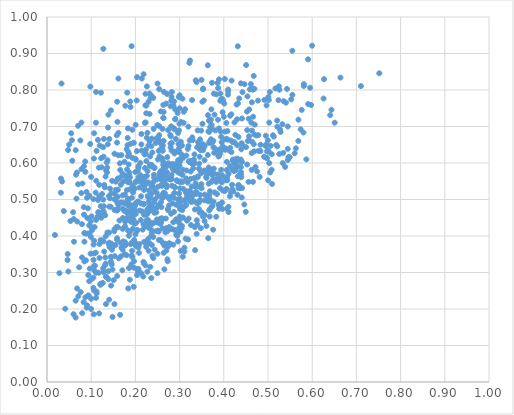
| Category | Series 0 |
|---|---|
| 0.1647939715330098 | 0.599 |
| 0.3296488042928043 | 0.663 |
| 0.3346389834372009 | 0.599 |
| 0.33762191764994354 | 0.515 |
| 0.2297007630078003 | 0.648 |
| 0.15261591563052823 | 0.625 |
| 0.5908335374797933 | 0.762 |
| 0.12536623478145625 | 0.388 |
| 0.2255001425843456 | 0.443 |
| 0.42042667537906664 | 0.606 |
| 0.11815101517886051 | 0.508 |
| 0.17698478531841477 | 0.489 |
| 0.28622173779922444 | 0.757 |
| 0.31093825995851043 | 0.368 |
| 0.25661514680877373 | 0.434 |
| 0.3094355039483727 | 0.74 |
| 0.5473262965644453 | 0.614 |
| 0.367297322441112 | 0.513 |
| 0.2713895836323079 | 0.575 |
| 0.2772224340666608 | 0.501 |
| 0.4302543847449444 | 0.649 |
| 0.38319195607002665 | 0.549 |
| 0.2485749285375688 | 0.445 |
| 0.17636445592563132 | 0.564 |
| 0.2336057651524588 | 0.315 |
| 0.2996886200430412 | 0.479 |
| 0.25508801380796475 | 0.66 |
| 0.40899809305417334 | 0.664 |
| 0.25129944985779873 | 0.535 |
| 0.17501720242080598 | 0.469 |
| 0.3499428072343981 | 0.465 |
| 0.5630660786194708 | 0.64 |
| 0.14795944715609466 | 0.368 |
| 0.03797411287125807 | 0.468 |
| 0.14467624653211975 | 0.744 |
| 0.40116485211009234 | 0.763 |
| 0.2738315659884206 | 0.474 |
| 0.46590479073345403 | 0.801 |
| 0.33956377801183313 | 0.643 |
| 0.05006779467766176 | 0.65 |
| 0.25382084795529924 | 0.676 |
| 0.2990725555899836 | 0.573 |
| 0.41190394632624827 | 0.635 |
| 0.2665732072668914 | 0.587 |
| 0.4742768268728017 | 0.675 |
| 0.0846050820085058 | 0.384 |
| 0.31850911607486776 | 0.638 |
| 0.07789140082200219 | 0.711 |
| 0.18537497727983654 | 0.559 |
| 0.05635231471708235 | 0.662 |
| 0.26652544996912586 | 0.517 |
| 0.534490510406444 | 0.628 |
| 0.2208340853105697 | 0.529 |
| 0.2981745127432366 | 0.604 |
| 0.19648067199287222 | 0.655 |
| 0.30014630612040805 | 0.453 |
| 0.28949408502922835 | 0.534 |
| 0.26065719416709865 | 0.612 |
| 0.3064782510306866 | 0.567 |
| 0.2575075019582751 | 0.578 |
| 0.40949966090398593 | 0.787 |
| 0.5283741248322352 | 0.685 |
| 0.22476542223128215 | 0.605 |
| 0.20374920556510723 | 0.293 |
| 0.5998748639182129 | 0.921 |
| 0.3040232195462842 | 0.55 |
| 0.14040509677185564 | 0.409 |
| 0.2809948103084713 | 0.592 |
| 0.44142245082074527 | 0.531 |
| 0.28187383681681566 | 0.634 |
| 0.48284424624885003 | 0.633 |
| 0.32511026864619885 | 0.577 |
| 0.28080038657756123 | 0.461 |
| 0.349253573783746 | 0.573 |
| 0.2510761549092184 | 0.669 |
| 0.43949723378462846 | 0.561 |
| 0.3108914225750865 | 0.357 |
| 0.08430921451962758 | 0.408 |
| 0.4910825050387383 | 0.617 |
| 0.11145956155170733 | 0.446 |
| 0.2006620672240952 | 0.61 |
| 0.2001423178722912 | 0.489 |
| 0.4191753414010959 | 0.528 |
| 0.2873403180074736 | 0.695 |
| 0.09809063970917131 | 0.809 |
| 0.41728528136156506 | 0.63 |
| 0.37633940543200106 | 0.661 |
| 0.18167989868245626 | 0.464 |
| 0.13749074659250005 | 0.651 |
| 0.09057907609075833 | 0.505 |
| 0.18641728948867753 | 0.481 |
| 0.19212587222503907 | 0.505 |
| 0.21419621945337441 | 0.634 |
| 0.3890711916613917 | 0.695 |
| 0.3890253256146563 | 0.829 |
| 0.22075345490812892 | 0.623 |
| 0.18592896989211471 | 0.566 |
| 0.3658662744370508 | 0.543 |
| 0.34368554078515245 | 0.585 |
| 0.2154283693391369 | 0.467 |
| 0.3285938205875122 | 0.51 |
| 0.4773770994988815 | 0.771 |
| 0.11815845854757323 | 0.464 |
| 0.3116836186258056 | 0.482 |
| 0.06812652151302867 | 0.256 |
| 0.40674776726601125 | 0.581 |
| 0.3972347624051046 | 0.646 |
| 0.2539481152054154 | 0.802 |
| 0.375955244850929 | 0.417 |
| 0.4571286858572807 | 0.673 |
| 0.21478598035384588 | 0.551 |
| 0.14253055604281417 | 0.53 |
| 0.13850229303876338 | 0.303 |
| 0.36855120450970136 | 0.523 |
| 0.09425794906401974 | 0.235 |
| 0.42748614694198195 | 0.587 |
| 0.14229569934855335 | 0.503 |
| 0.14496811035945567 | 0.264 |
| 0.4062189444925989 | 0.666 |
| 0.25755275222533813 | 0.741 |
| 0.1276594729834536 | 0.385 |
| 0.18737355944792433 | 0.28 |
| 0.21086253143700118 | 0.6 |
| 0.3287115400195506 | 0.67 |
| 0.20919622331926857 | 0.378 |
| 0.16659466457018457 | 0.382 |
| 0.36746695713342425 | 0.575 |
| 0.18326552090975357 | 0.695 |
| 0.3462872330939749 | 0.498 |
| 0.21357353155485226 | 0.651 |
| 0.1603434346535838 | 0.527 |
| 0.2996161749616153 | 0.631 |
| 0.37347138082333575 | 0.482 |
| 0.22461952019975628 | 0.736 |
| 0.5951610029169132 | 0.806 |
| 0.2354188223527548 | 0.4 |
| 0.12729586223840894 | 0.5 |
| 0.471642452112225 | 0.589 |
| 0.194127261426827 | 0.419 |
| 0.18995176041122908 | 0.484 |
| 0.298224406915763 | 0.781 |
| 0.2319900135597165 | 0.79 |
| 0.2751013923758229 | 0.419 |
| 0.05308583910887732 | 0.441 |
| 0.3779835917815346 | 0.641 |
| 0.2822735137336819 | 0.655 |
| 0.4635935793490755 | 0.766 |
| 0.351763459391364 | 0.708 |
| 0.060628804464220365 | 0.446 |
| 0.2639372308687683 | 0.519 |
| 0.3556832871718867 | 0.579 |
| 0.22713031381695115 | 0.473 |
| 0.18684243046870397 | 0.466 |
| 0.3872207297792363 | 0.805 |
| 0.25666617675482495 | 0.566 |
| 0.28958253160801994 | 0.631 |
| 0.1638684017903983 | 0.442 |
| 0.21203059791569256 | 0.49 |
| 0.3765000238493391 | 0.643 |
| 0.16138859538170192 | 0.485 |
| 0.054746374601786774 | 0.681 |
| 0.23191125631109466 | 0.434 |
| 0.3150341836402435 | 0.485 |
| 0.21541485835048269 | 0.545 |
| 0.23600839715194932 | 0.285 |
| 0.11088413611356873 | 0.444 |
| 0.14002545817197398 | 0.378 |
| 0.09555676504028565 | 0.276 |
| 0.3077213433920589 | 0.451 |
| 0.2368907134400977 | 0.594 |
| 0.5763136269737836 | 0.745 |
| 0.13812374603403277 | 0.697 |
| 0.11708198575406847 | 0.299 |
| 0.04832415594206252 | 0.303 |
| 0.29364730229215485 | 0.553 |
| 0.4348302035152728 | 0.777 |
| 0.43696240262212016 | 0.569 |
| 0.4316078034686536 | 0.92 |
| 0.2588401053298447 | 0.54 |
| 0.12942940988710783 | 0.357 |
| 0.17668017705753625 | 0.383 |
| 0.3477534670356346 | 0.635 |
| 0.3535053410008212 | 0.804 |
| 0.20902168101564067 | 0.533 |
| 0.17655204370631317 | 0.427 |
| 0.2029014615031599 | 0.771 |
| 0.5449253184525242 | 0.608 |
| 0.5354830249315363 | 0.77 |
| 0.345422614897573 | 0.617 |
| 0.1924565573758702 | 0.359 |
| 0.22061296757219562 | 0.542 |
| 0.3000659118283072 | 0.48 |
| 0.382197975396946 | 0.549 |
| 0.2472508372198312 | 0.465 |
| 0.08973611936823556 | 0.204 |
| 0.2613415738568926 | 0.421 |
| 0.39829568145162464 | 0.771 |
| 0.14113612122213814 | 0.382 |
| 0.34877354876501687 | 0.639 |
| 0.11212122700714666 | 0.633 |
| 0.43447315165958633 | 0.539 |
| 0.2261036641865084 | 0.439 |
| 0.1587540044667468 | 0.29 |
| 0.387870859498719 | 0.618 |
| 0.32953393785021035 | 0.597 |
| 0.2929706530710764 | 0.59 |
| 0.4468325514531809 | 0.816 |
| 0.3945262647806934 | 0.776 |
| 0.420785772248225 | 0.657 |
| 0.2638187566673844 | 0.661 |
| 0.3774243048237689 | 0.79 |
| 0.25527097274122235 | 0.564 |
| 0.30904837346473124 | 0.71 |
| 0.22746149448730857 | 0.578 |
| 0.19221820063633854 | 0.439 |
| 0.29952139181425086 | 0.708 |
| 0.13314385357230218 | 0.288 |
| 0.1273953675940933 | 0.468 |
| 0.3607926117992437 | 0.427 |
| 0.4300179218663891 | 0.72 |
| 0.13081211867833964 | 0.533 |
| 0.07933771651979449 | 0.341 |
| 0.40350693911649527 | 0.665 |
| 0.14099366557188198 | 0.481 |
| 0.31231977372278796 | 0.747 |
| 0.32652272333358123 | 0.506 |
| 0.3783211506762546 | 0.57 |
| 0.180735834162843 | 0.551 |
| 0.18019745831020595 | 0.638 |
| 0.2738450721187934 | 0.371 |
| 0.06488275699159596 | 0.177 |
| 0.20387392045812125 | 0.414 |
| 0.14146727080263255 | 0.37 |
| 0.5003422238031873 | 0.552 |
| 0.2864411433174173 | 0.579 |
| 0.4367792476505129 | 0.531 |
| 0.06566028808915592 | 0.568 |
| 0.1060943666346501 | 0.612 |
| 0.3868659096062068 | 0.718 |
| 0.45281727678650263 | 0.596 |
| 0.37188593597330666 | 0.747 |
| 0.20810304587223571 | 0.354 |
| 0.19326187618402246 | 0.473 |
| 0.25746634597577733 | 0.437 |
| 0.43761960241049613 | 0.605 |
| 0.15352347213316886 | 0.516 |
| 0.21800872545140915 | 0.487 |
| 0.4232769941651271 | 0.578 |
| 0.58104032800931 | 0.811 |
| 0.19175193177237448 | 0.381 |
| 0.296405056466694 | 0.682 |
| 0.3792669518827594 | 0.519 |
| 0.4390596294236092 | 0.568 |
| 0.2907179519780627 | 0.581 |
| 0.20344177734462576 | 0.632 |
| 0.20697418069519924 | 0.592 |
| 0.29860160313383644 | 0.689 |
| 0.30084642830645714 | 0.413 |
| 0.11077418320796817 | 0.71 |
| 0.10658763505802082 | 0.387 |
| 0.16747363521237446 | 0.492 |
| 0.29811156852533494 | 0.444 |
| 0.08367653704714728 | 0.459 |
| 0.29548224478276053 | 0.737 |
| 0.21988092177400098 | 0.561 |
| 0.3910449711406687 | 0.624 |
| 0.39033286827684954 | 0.486 |
| 0.2619394836617225 | 0.515 |
| 0.19335510998716965 | 0.614 |
| 0.3565175126404019 | 0.441 |
| 0.38293541549574295 | 0.453 |
| 0.2016309802505124 | 0.436 |
| 0.2582608704443117 | 0.639 |
| 0.3307873331639657 | 0.585 |
| 0.5738992138250303 | 0.692 |
| 0.45261376754877114 | 0.741 |
| 0.5237222967615204 | 0.772 |
| 0.14450206085034734 | 0.343 |
| 0.2784181549029955 | 0.554 |
| 0.13659565769713522 | 0.41 |
| 0.15258187530581735 | 0.213 |
| 0.10507256999325709 | 0.501 |
| 0.41967852787531057 | 0.581 |
| 0.40802394483468696 | 0.553 |
| 0.26567604174414217 | 0.373 |
| 0.2630679654716378 | 0.724 |
| 0.12614823692552335 | 0.271 |
| 0.19897103944509842 | 0.482 |
| 0.4273425639853434 | 0.58 |
| 0.18777141332871294 | 0.561 |
| 0.2516660846730525 | 0.485 |
| 0.188868202144291 | 0.753 |
| 0.5018446119966193 | 0.773 |
| 0.3790283776144231 | 0.732 |
| 0.2870933180382793 | 0.505 |
| 0.37313942357500474 | 0.693 |
| 0.13515703670450208 | 0.602 |
| 0.46856059984356424 | 0.632 |
| 0.2708862609904741 | 0.534 |
| 0.1071878446467911 | 0.306 |
| 0.18991546663185044 | 0.439 |
| 0.08645060279063177 | 0.604 |
| 0.14730256082309756 | 0.551 |
| 0.08675799114609484 | 0.576 |
| 0.2898497401634119 | 0.72 |
| 0.3046980028808909 | 0.421 |
| 0.2880395469351211 | 0.518 |
| 0.11090850244926054 | 0.795 |
| 0.5210912155808026 | 0.646 |
| 0.16163529005334842 | 0.683 |
| 0.18366833497438528 | 0.547 |
| 0.12699164677895103 | 0.643 |
| 0.19627278884995836 | 0.261 |
| 0.16532766778223218 | 0.184 |
| 0.2963913024135022 | 0.385 |
| 0.21866151555028857 | 0.843 |
| 0.22856097162005518 | 0.444 |
| 0.1972224045552785 | 0.389 |
| 0.38820374686924264 | 0.559 |
| 0.4216016945182941 | 0.523 |
| 0.3872749318704888 | 0.569 |
| 0.3166752571393261 | 0.442 |
| 0.38954114167191956 | 0.475 |
| 0.1882914660743894 | 0.769 |
| 0.23120081111944646 | 0.525 |
| 0.16143175192625747 | 0.621 |
| 0.30880419352948596 | 0.479 |
| 0.4309311417858266 | 0.612 |
| 0.12455771508005709 | 0.515 |
| 0.1205204012066865 | 0.453 |
| 0.13409742405989178 | 0.288 |
| 0.028107240281665002 | 0.298 |
| 0.2961866596243232 | 0.5 |
| 0.2843674087744281 | 0.418 |
| 0.18147551100399084 | 0.793 |
| 0.32058540790174606 | 0.605 |
| 0.23411450789792632 | 0.505 |
| 0.5906567446229637 | 0.884 |
| 0.24782632222368906 | 0.555 |
| 0.19369060927819715 | 0.454 |
| 0.2722424724421352 | 0.616 |
| 0.42890816676925725 | 0.76 |
| 0.21647471177873823 | 0.417 |
| 0.4234377264464194 | 0.607 |
| 0.3231393753442291 | 0.496 |
| 0.031371623927149095 | 0.519 |
| 0.27887664628371867 | 0.677 |
| 0.15242835232463248 | 0.5 |
| 0.16024132553520287 | 0.472 |
| 0.5041453948584654 | 0.795 |
| 0.15855027727695958 | 0.39 |
| 0.4139972379782424 | 0.591 |
| 0.17046858633438744 | 0.306 |
| 0.3952479426353377 | 0.547 |
| 0.17163187536608326 | 0.449 |
| 0.36516707276118454 | 0.686 |
| 0.09860427875357602 | 0.352 |
| 0.2808930256775579 | 0.7 |
| 0.552445748835957 | 0.774 |
| 0.23957662759281817 | 0.47 |
| 0.3447059654868093 | 0.493 |
| 0.23336309041315162 | 0.618 |
| 0.31699700579843426 | 0.509 |
| 0.33837512258237956 | 0.521 |
| 0.33904828539429654 | 0.443 |
| 0.4560072169308391 | 0.548 |
| 0.24086482334978354 | 0.477 |
| 0.3951139754813069 | 0.657 |
| 0.5603654522387099 | 0.627 |
| 0.2513454065898899 | 0.415 |
| 0.2195017560258138 | 0.324 |
| 0.4107036376516858 | 0.57 |
| 0.07919833234204954 | 0.433 |
| 0.26313125053751707 | 0.759 |
| 0.34078570848893097 | 0.689 |
| 0.19936715679563277 | 0.471 |
| 0.21762919772788136 | 0.289 |
| 0.3346927307715245 | 0.473 |
| 0.22330226503499817 | 0.711 |
| 0.38601296390546924 | 0.819 |
| 0.2671677980541054 | 0.418 |
| 0.09610256123921534 | 0.405 |
| 0.17117692102262017 | 0.42 |
| 0.3773856847078504 | 0.585 |
| 0.2068660640069816 | 0.587 |
| 0.5867636477734147 | 0.61 |
| 0.20151113419221944 | 0.55 |
| 0.5491047804863667 | 0.616 |
| 0.24243846680832637 | 0.493 |
| 0.09584868953165637 | 0.51 |
| 0.46788146971948164 | 0.651 |
| 0.36797212659851064 | 0.453 |
| 0.23661900717484297 | 0.535 |
| 0.0845304450961365 | 0.33 |
| 0.4283230491467602 | 0.605 |
| 0.21848310341569566 | 0.56 |
| 0.2701966178031068 | 0.36 |
| 0.23608160003416534 | 0.646 |
| 0.364231549810355 | 0.731 |
| 0.18289324723321765 | 0.485 |
| 0.4810988252088474 | 0.562 |
| 0.39619857013372994 | 0.492 |
| 0.09873966650565891 | 0.44 |
| 0.200145888108329 | 0.611 |
| 0.06484653317821587 | 0.223 |
| 0.2007280641397916 | 0.46 |
| 0.3783735266955951 | 0.628 |
| 0.5028556449843677 | 0.711 |
| 0.2612487131938175 | 0.574 |
| 0.38664168743398886 | 0.625 |
| 0.5112424362113462 | 0.676 |
| 0.23326661295027307 | 0.477 |
| 0.12878882973791306 | 0.666 |
| 0.24851042437558757 | 0.437 |
| 0.38947563777544303 | 0.552 |
| 0.1914646285838778 | 0.447 |
| 0.26418470500504343 | 0.551 |
| 0.16559949123449647 | 0.581 |
| 0.33239191014496106 | 0.495 |
| 0.22788818703174607 | 0.51 |
| 0.4097680889912587 | 0.801 |
| 0.298784340714921 | 0.641 |
| 0.35239434901537736 | 0.652 |
| 0.3364129223218144 | 0.534 |
| 0.33649824223492486 | 0.827 |
| 0.16841978085365583 | 0.368 |
| 0.46311401323027523 | 0.581 |
| 0.3569143768237838 | 0.513 |
| 0.12210078643533351 | 0.793 |
| 0.23179522210153414 | 0.482 |
| 0.1955162726841153 | 0.444 |
| 0.4034353007921133 | 0.64 |
| 0.15784900398433954 | 0.676 |
| 0.30276907878570314 | 0.658 |
| 0.26748854203841343 | 0.553 |
| 0.05729101526625524 | 0.606 |
| 0.5550075964932493 | 0.907 |
| 0.06490964638963592 | 0.635 |
| 0.4780767472604479 | 0.676 |
| 0.2354402548103799 | 0.591 |
| 0.25493606419585946 | 0.482 |
| 0.09971136402197955 | 0.2 |
| 0.1482501740074288 | 0.178 |
| 0.23579756177133337 | 0.431 |
| 0.34544205208558343 | 0.464 |
| 0.3668579692213012 | 0.47 |
| 0.5325094253735185 | 0.706 |
| 0.49974417919914926 | 0.662 |
| 0.32586002518244983 | 0.43 |
| 0.3013700176890459 | 0.547 |
| 0.4204832697366433 | 0.609 |
| 0.6406821902202587 | 0.731 |
| 0.4176272339730057 | 0.826 |
| 0.10587890236037167 | 0.185 |
| 0.11783368638697767 | 0.188 |
| 0.1604238845909136 | 0.557 |
| 0.5975419826118344 | 0.759 |
| 0.5685767910237229 | 0.66 |
| 0.07274810485007044 | 0.314 |
| 0.24044292683826718 | 0.397 |
| 0.2057396707156267 | 0.303 |
| 0.3724094886490623 | 0.705 |
| 0.11530931485588503 | 0.455 |
| 0.26391145764953994 | 0.74 |
| 0.44111591338857903 | 0.722 |
| 0.21142710205346316 | 0.567 |
| 0.3889877946816822 | 0.619 |
| 0.39668311991818206 | 0.474 |
| 0.3324022462487728 | 0.609 |
| 0.09325651944488356 | 0.293 |
| 0.3184559965028929 | 0.506 |
| 0.2291687605417474 | 0.547 |
| 0.5008434358910254 | 0.781 |
| 0.1400712346753844 | 0.509 |
| 0.25449152506829065 | 0.618 |
| 0.2319155314449537 | 0.66 |
| 0.22566715115999458 | 0.669 |
| 0.43885884987273327 | 0.818 |
| 0.3940363251144703 | 0.581 |
| 0.36024374724946284 | 0.562 |
| 0.11145966501048876 | 0.551 |
| 0.36463068685037225 | 0.505 |
| 0.20182760043902437 | 0.49 |
| 0.3026064226872245 | 0.481 |
| 0.643609763346324 | 0.746 |
| 0.2668540206870107 | 0.572 |
| 0.360874153834538 | 0.559 |
| 0.09561100855778859 | 0.429 |
| 0.28405035028338466 | 0.489 |
| 0.1280174498363772 | 0.617 |
| 0.2425298792840408 | 0.586 |
| 0.1722319628625958 | 0.549 |
| 0.11088827731997675 | 0.23 |
| 0.3552108441858982 | 0.643 |
| 0.23171069810911138 | 0.508 |
| 0.34639138467316144 | 0.513 |
| 0.12287525046762171 | 0.45 |
| 0.2750640381614846 | 0.561 |
| 0.046488510117494886 | 0.334 |
| 0.3669111682286832 | 0.685 |
| 0.2919891776059884 | 0.486 |
| 0.4660426579195731 | 0.548 |
| 0.42411818060242124 | 0.657 |
| 0.3051806606866402 | 0.428 |
| 0.2723736091687511 | 0.336 |
| 0.21981949499871323 | 0.384 |
| 0.3649706649762513 | 0.575 |
| 0.12875406309552317 | 0.481 |
| 0.38771608741725994 | 0.486 |
| 0.08350045152788799 | 0.591 |
| 0.5058646368266709 | 0.647 |
| 0.2072138243632261 | 0.31 |
| 0.08928730240412563 | 0.521 |
| 0.28899164485118667 | 0.534 |
| 0.22634369102974716 | 0.46 |
| 0.43853945420302975 | 0.61 |
| 0.29528019908170855 | 0.551 |
| 0.4979404217771686 | 0.613 |
| 0.14619365017766417 | 0.379 |
| 0.23831763728832778 | 0.415 |
| 0.12118531813575462 | 0.389 |
| 0.13585559842650252 | 0.574 |
| 0.17715062628305445 | 0.757 |
| 0.1822023593720853 | 0.649 |
| 0.36222496673105764 | 0.51 |
| 0.2873479585231097 | 0.466 |
| 0.3677913634405269 | 0.715 |
| 0.22700371278233067 | 0.302 |
| 0.10551803346845723 | 0.377 |
| 0.4389594247631393 | 0.575 |
| 0.15562055045226086 | 0.549 |
| 0.2384216653685447 | 0.346 |
| 0.2881314494010434 | 0.692 |
| 0.40010812570405063 | 0.727 |
| 0.2219587382310234 | 0.383 |
| 0.23832003061711782 | 0.629 |
| 0.07803924491553205 | 0.583 |
| 0.49922059102592675 | 0.635 |
| 0.07016042481088292 | 0.702 |
| 0.15304580461917494 | 0.345 |
| 0.3294367233481791 | 0.597 |
| 0.18581514434723834 | 0.574 |
| 0.08321944979097506 | 0.479 |
| 0.2233891294120559 | 0.626 |
| 0.3205066251263261 | 0.448 |
| 0.24050470917307343 | 0.779 |
| 0.17996764224720707 | 0.347 |
| 0.3570504685576411 | 0.648 |
| 0.144523857889448 | 0.33 |
| 0.041261056608529856 | 0.201 |
| 0.3679315527185718 | 0.655 |
| 0.296485027358117 | 0.607 |
| 0.13717188076558873 | 0.607 |
| 0.23306897350721445 | 0.595 |
| 0.3708169272852141 | 0.719 |
| 0.24126993085654747 | 0.694 |
| 0.3638048722539493 | 0.622 |
| 0.17128310357145937 | 0.362 |
| 0.2816445149015575 | 0.567 |
| 0.30163369600224177 | 0.412 |
| 0.20698232157835117 | 0.368 |
| 0.3004123001888682 | 0.653 |
| 0.09370025072362809 | 0.407 |
| 0.15750141112741523 | 0.425 |
| 0.19647153900072856 | 0.313 |
| 0.28280018649993033 | 0.538 |
| 0.2880109260176261 | 0.585 |
| 0.16702478891117634 | 0.54 |
| 0.18380150113592886 | 0.256 |
| 0.34327361559612213 | 0.475 |
| 0.24179784570147922 | 0.47 |
| 0.19452887884731063 | 0.52 |
| 0.177038932120956 | 0.375 |
| 0.29038915558344003 | 0.721 |
| 0.2621565342230542 | 0.648 |
| 0.21822189289479654 | 0.329 |
| 0.5167364503196195 | 0.804 |
| 0.15875519821599726 | 0.492 |
| 0.16047126635736408 | 0.424 |
| 0.11025521503642166 | 0.354 |
| 0.3808877576892922 | 0.689 |
| 0.23223272144528107 | 0.734 |
| 0.24784761827383794 | 0.476 |
| 0.185232759736482 | 0.624 |
| 0.09980298202749549 | 0.228 |
| 0.21822471312298009 | 0.432 |
| 0.2823750426701135 | 0.556 |
| 0.33994863088760585 | 0.432 |
| 0.223232291371664 | 0.431 |
| 0.09919603150981116 | 0.398 |
| 0.0869653304040745 | 0.232 |
| 0.2693519935784281 | 0.589 |
| 0.34801622424860346 | 0.422 |
| 0.2194593784585266 | 0.526 |
| 0.20368832994703812 | 0.31 |
| 0.11868757868861013 | 0.378 |
| 0.6639072299410159 | 0.834 |
| 0.1480798386275597 | 0.308 |
| 0.30004494443006 | 0.75 |
| 0.3638128477422815 | 0.868 |
| 0.2848091166166069 | 0.598 |
| 0.22993991303634642 | 0.359 |
| 0.37680859968743896 | 0.494 |
| 0.41377213182608163 | 0.509 |
| 0.0316076073923095 | 0.557 |
| 0.2797470533510582 | 0.643 |
| 0.22230967366755017 | 0.426 |
| 0.4217179741003194 | 0.583 |
| 0.5017016979580184 | 0.631 |
| 0.5091986739820407 | 0.543 |
| 0.176318943794463 | 0.513 |
| 0.37100141947419896 | 0.665 |
| 0.19686086058801344 | 0.331 |
| 0.10505485561162797 | 0.258 |
| 0.3136547005409849 | 0.393 |
| 0.1833465680947317 | 0.493 |
| 0.23256122896637377 | 0.437 |
| 0.27966348894194193 | 0.755 |
| 0.40330481632449544 | 0.56 |
| 0.5810925250940719 | 0.816 |
| 0.3289220863852098 | 0.604 |
| 0.2290203496050075 | 0.392 |
| 0.751754294185146 | 0.846 |
| 0.2555415310397261 | 0.447 |
| 0.08022879403794325 | 0.544 |
| 0.34936999435192173 | 0.542 |
| 0.05912144220118054 | 0.465 |
| 0.0967690685982795 | 0.311 |
| 0.265850769600098 | 0.569 |
| 0.19081167718960446 | 0.322 |
| 0.4295704976585185 | 0.593 |
| 0.14562001764070287 | 0.517 |
| 0.46909085945633167 | 0.678 |
| 0.3972879590684104 | 0.775 |
| 0.2573657033671617 | 0.654 |
| 0.24790765993116026 | 0.667 |
| 0.14111145235667577 | 0.666 |
| 0.3664659989783481 | 0.717 |
| 0.15804765029229773 | 0.47 |
| 0.1076916737189838 | 0.424 |
| 0.314796123033409 | 0.558 |
| 0.30142843832038124 | 0.492 |
| 0.219482265980106 | 0.554 |
| 0.08859875760898761 | 0.407 |
| 0.3488886688772259 | 0.689 |
| 0.5027773690471709 | 0.6 |
| 0.17570691641037328 | 0.35 |
| 0.155011813995375 | 0.375 |
| 0.25152496713321637 | 0.661 |
| 0.22952624681806122 | 0.465 |
| 0.4496502323289575 | 0.466 |
| 0.1823828719292544 | 0.45 |
| 0.2434364864245585 | 0.587 |
| 0.5447160965677573 | 0.7 |
| 0.2702393524209522 | 0.54 |
| 0.4405617355308937 | 0.506 |
| 0.17844051916347425 | 0.443 |
| 0.42617441131606193 | 0.677 |
| 0.45353518282293703 | 0.782 |
| 0.10487579799680857 | 0.286 |
| 0.3146997718270972 | 0.518 |
| 0.49412678982043423 | 0.647 |
| 0.4959776441867969 | 0.651 |
| 0.1308706844740335 | 0.32 |
| 0.21503648265094244 | 0.556 |
| 0.3973230467009067 | 0.525 |
| 0.3365806504282334 | 0.537 |
| 0.40703984580568575 | 0.603 |
| 0.4693655245707693 | 0.803 |
| 0.3110560294898549 | 0.496 |
| 0.15213408703232312 | 0.413 |
| 0.30333171368788125 | 0.712 |
| 0.2730746591250548 | 0.331 |
| 0.2960317264156379 | 0.631 |
| 0.22885391183375148 | 0.441 |
| 0.26761779888622117 | 0.379 |
| 0.2531742235012645 | 0.389 |
| 0.38459638209613534 | 0.515 |
| 0.14076510090118988 | 0.225 |
| 0.2550357922788371 | 0.572 |
| 0.1899932054200325 | 0.464 |
| 0.3405642096305851 | 0.56 |
| 0.23301284728752392 | 0.593 |
| 0.11922943968790656 | 0.648 |
| 0.17821774694083858 | 0.376 |
| 0.31561868395464787 | 0.58 |
| 0.4227586442026684 | 0.599 |
| 0.4426373551579156 | 0.648 |
| 0.3498376652400045 | 0.531 |
| 0.2501416328845516 | 0.818 |
| 0.5447063481385583 | 0.639 |
| 0.3740491228931835 | 0.483 |
| 0.21795558634255108 | 0.539 |
| 0.15272060167072388 | 0.471 |
| 0.12702839983995073 | 0.311 |
| 0.5049274558441662 | 0.574 |
| 0.6268285731901801 | 0.83 |
| 0.49791204753401563 | 0.631 |
| 0.24746181030265268 | 0.413 |
| 0.31641455890173287 | 0.519 |
| 0.22425925474879593 | 0.37 |
| 0.25447314387112163 | 0.435 |
| 0.12826113126677863 | 0.465 |
| 0.28760594527724015 | 0.769 |
| 0.1875808547880935 | 0.528 |
| 0.43218800403495616 | 0.764 |
| 0.2761019262488813 | 0.484 |
| 0.28257506707946833 | 0.794 |
| 0.34454220425543836 | 0.598 |
| 0.120716459561507 | 0.267 |
| 0.13345800503286243 | 0.214 |
| 0.12253039625316875 | 0.613 |
| 0.3013768005095915 | 0.605 |
| 0.5086965122145729 | 0.624 |
| 0.1926488986140601 | 0.342 |
| 0.34607845137235504 | 0.535 |
| 0.23399589641765062 | 0.777 |
| 0.12134801427802944 | 0.269 |
| 0.2041021687383585 | 0.417 |
| 0.2812000907925387 | 0.77 |
| 0.49183834107651725 | 0.773 |
| 0.22460966084730005 | 0.385 |
| 0.2399320419204245 | 0.547 |
| 0.5211495941940429 | 0.699 |
| 0.3464332903737184 | 0.665 |
| 0.1842241620753382 | 0.63 |
| 0.3762224779936806 | 0.555 |
| 0.3421087024865974 | 0.657 |
| 0.27379644274012993 | 0.471 |
| 0.26291082856440684 | 0.507 |
| 0.16153816485746353 | 0.831 |
| 0.41046705472841505 | 0.48 |
| 0.22390997900353837 | 0.637 |
| 0.23904276945293967 | 0.536 |
| 0.2628818286735004 | 0.595 |
| 0.032845565183884706 | 0.818 |
| 0.20119405755092146 | 0.373 |
| 0.2857993528858863 | 0.376 |
| 0.542927583579805 | 0.803 |
| 0.18740933888181643 | 0.443 |
| 0.2571475367668544 | 0.555 |
| 0.4626707045390662 | 0.806 |
| 0.2353152576963694 | 0.484 |
| 0.3741456250802032 | 0.657 |
| 0.3162019805111844 | 0.523 |
| 0.40769358055771576 | 0.475 |
| 0.15103680761039828 | 0.279 |
| 0.39125106216615446 | 0.483 |
| 0.07555694035829097 | 0.662 |
| 0.15258260542680613 | 0.418 |
| 0.47793036327751026 | 0.633 |
| 0.0703737221579166 | 0.542 |
| 0.15566772812893848 | 0.527 |
| 0.2889271042171969 | 0.417 |
| 0.30599896194139864 | 0.471 |
| 0.20114250903511444 | 0.548 |
| 0.11236929443203358 | 0.243 |
| 0.18901554821597 | 0.653 |
| 0.2575925518536144 | 0.557 |
| 0.26573192432167736 | 0.567 |
| 0.2610012830160894 | 0.446 |
| 0.45027011753862833 | 0.643 |
| 0.2607290040211162 | 0.504 |
| 0.3022183088573873 | 0.359 |
| 0.16912931410189203 | 0.564 |
| 0.21050686511077688 | 0.552 |
| 0.38408592396394914 | 0.636 |
| 0.13891383111727318 | 0.732 |
| 0.06854506754688261 | 0.44 |
| 0.527218222736372 | 0.692 |
| 0.17269728042489518 | 0.385 |
| 0.4023128644058107 | 0.83 |
| 0.46379343146835716 | 0.689 |
| 0.24309619447499964 | 0.464 |
| 0.26812480562714724 | 0.41 |
| 0.22844805985306127 | 0.435 |
| 0.2636590367901561 | 0.586 |
| 0.2363967911140522 | 0.516 |
| 0.2580824947094381 | 0.493 |
| 0.18557450378954887 | 0.312 |
| 0.35695110970991095 | 0.498 |
| 0.44224356765901685 | 0.794 |
| 0.5335269425643202 | 0.6 |
| 0.3227690480284875 | 0.662 |
| 0.4829672613346422 | 0.65 |
| 0.4410606097416029 | 0.603 |
| 0.47008624030505164 | 0.705 |
| 0.18115349168559436 | 0.582 |
| 0.2259061403176067 | 0.81 |
| 0.43257295317979194 | 0.539 |
| 0.17102255612526962 | 0.371 |
| 0.3073551902977537 | 0.582 |
| 0.5801515810218293 | 0.683 |
| 0.41872899376511485 | 0.54 |
| 0.14702743066838997 | 0.362 |
| 0.1975016514468414 | 0.528 |
| 0.11009976105858121 | 0.519 |
| 0.2438881733284508 | 0.525 |
| 0.2100799026508362 | 0.47 |
| 0.17139288343804693 | 0.475 |
| 0.40576535146172654 | 0.71 |
| 0.27401876811893766 | 0.69 |
| 0.19150611080107272 | 0.473 |
| 0.47541722533383934 | 0.577 |
| 0.12776833172266555 | 0.457 |
| 0.01794504644865824 | 0.403 |
| 0.3525897749734671 | 0.454 |
| 0.34720920047264503 | 0.642 |
| 0.1831724781228753 | 0.618 |
| 0.29440846931290443 | 0.401 |
| 0.24993990574574587 | 0.351 |
| 0.3317094828123437 | 0.517 |
| 0.4331330397784866 | 0.672 |
| 0.4613497647476569 | 0.816 |
| 0.12112623389851873 | 0.267 |
| 0.2132857602320809 | 0.298 |
| 0.5387877253529123 | 0.589 |
| 0.115321230413992 | 0.499 |
| 0.305436284937991 | 0.648 |
| 0.3382447945648225 | 0.822 |
| 0.3182590251483878 | 0.546 |
| 0.28402739392105836 | 0.586 |
| 0.21973231305113594 | 0.458 |
| 0.09074786520682587 | 0.21 |
| 0.3614314112083724 | 0.57 |
| 0.1597950797454294 | 0.507 |
| 0.2975438974541681 | 0.652 |
| 0.23224906864910455 | 0.38 |
| 0.13210745673153312 | 0.341 |
| 0.26558052740689686 | 0.309 |
| 0.3928322511610669 | 0.686 |
| 0.46317877499278703 | 0.627 |
| 0.1914798809815833 | 0.347 |
| 0.25276833251760145 | 0.633 |
| 0.3202416809585851 | 0.647 |
| 0.3198773386632153 | 0.511 |
| 0.4043464945292874 | 0.553 |
| 0.15950379172255014 | 0.473 |
| 0.1866929280723253 | 0.549 |
| 0.41076608522393065 | 0.466 |
| 0.2857316508366451 | 0.438 |
| 0.2944011839827746 | 0.551 |
| 0.22286088915845093 | 0.789 |
| 0.23699533919836935 | 0.667 |
| 0.26192931608839 | 0.381 |
| 0.18257515459078655 | 0.461 |
| 0.39068067888850955 | 0.637 |
| 0.29501765219306286 | 0.599 |
| 0.2371846773287305 | 0.376 |
| 0.2963294296063965 | 0.588 |
| 0.3690658031047016 | 0.698 |
| 0.09943082253424451 | 0.426 |
| 0.336295746997486 | 0.544 |
| 0.10664100362351137 | 0.318 |
| 0.20590820000640453 | 0.551 |
| 0.40309518675692213 | 0.636 |
| 0.1152146347212698 | 0.663 |
| 0.09248935830527127 | 0.476 |
| 0.25376614868948677 | 0.701 |
| 0.26097655757533944 | 0.641 |
| 0.41703564652340963 | 0.733 |
| 0.12431676375136558 | 0.48 |
| 0.3000401884018903 | 0.61 |
| 0.14393375538859876 | 0.48 |
| 0.4309104399332041 | 0.513 |
| 0.42742065676359187 | 0.611 |
| 0.36487979464243014 | 0.495 |
| 0.2802320195818072 | 0.673 |
| 0.5462766060189465 | 0.616 |
| 0.21443101321828606 | 0.832 |
| 0.46231202391066173 | 0.71 |
| 0.08815315788244349 | 0.333 |
| 0.19724601835238353 | 0.378 |
| 0.12746784804435263 | 0.913 |
| 0.40720698926497123 | 0.561 |
| 0.10652780238946269 | 0.352 |
| 0.16260920804181678 | 0.339 |
| 0.3714699213346765 | 0.662 |
| 0.4950637587412974 | 0.675 |
| 0.34345717643222484 | 0.653 |
| 0.26959678935776676 | 0.763 |
| 0.39366537501183496 | 0.634 |
| 0.04682777632318602 | 0.351 |
| 0.225555553375423 | 0.467 |
| 0.2404412402389059 | 0.34 |
| 0.2571970406044626 | 0.388 |
| 0.37344234656275344 | 0.82 |
| 0.2795586908675326 | 0.378 |
| 0.15858212295773488 | 0.394 |
| 0.25105719870774457 | 0.509 |
| 0.5083292696927699 | 0.581 |
| 0.2985789503056874 | 0.436 |
| 0.30101409206092533 | 0.474 |
| 0.12791988412315114 | 0.301 |
| 0.2575649641931278 | 0.438 |
| 0.15871501850780034 | 0.768 |
| 0.38977865027546943 | 0.484 |
| 0.32665326493711766 | 0.493 |
| 0.06664013280653547 | 0.502 |
| 0.45792933316722617 | 0.662 |
| 0.3919515343138237 | 0.77 |
| 0.13176333835273413 | 0.457 |
| 0.3385732942278151 | 0.406 |
| 0.172938830876729 | 0.491 |
| 0.17118400913752585 | 0.511 |
| 0.06766596336323183 | 0.574 |
| 0.2817062276239539 | 0.781 |
| 0.1390691704033229 | 0.282 |
| 0.2440188735721719 | 0.5 |
| 0.07082280673708263 | 0.235 |
| 0.2744431210689664 | 0.599 |
| 0.41619475006660844 | 0.662 |
| 0.4333056279213491 | 0.532 |
| 0.29980510347417133 | 0.593 |
| 0.3515141201817449 | 0.768 |
| 0.12353870067811534 | 0.588 |
| 0.224216441236753 | 0.543 |
| 0.3232238249818613 | 0.523 |
| 0.22136568482822871 | 0.71 |
| 0.5552465635500049 | 0.787 |
| 0.23624909140431127 | 0.541 |
| 0.11724229310206113 | 0.587 |
| 0.19309701433935822 | 0.691 |
| 0.5245476077013758 | 0.81 |
| 0.19997913530506373 | 0.404 |
| 0.22169911898644978 | 0.586 |
| 0.2227355494094786 | 0.758 |
| 0.3685570094564936 | 0.501 |
| 0.2636333722449906 | 0.723 |
| 0.06108403846084398 | 0.384 |
| 0.1829664443843928 | 0.415 |
| 0.24226390307796974 | 0.56 |
| 0.6508822310744169 | 0.71 |
| 0.24987236657558098 | 0.298 |
| 0.44637988827359487 | 0.486 |
| 0.496788837039182 | 0.758 |
| 0.3080488272710643 | 0.529 |
| 0.414292970181364 | 0.642 |
| 0.4319412127330564 | 0.564 |
| 0.408184824290483 | 0.687 |
| 0.17133692470402706 | 0.571 |
| 0.2037368749261843 | 0.835 |
| 0.3529885050327324 | 0.635 |
| 0.33363805996559026 | 0.624 |
| 0.2053711423795811 | 0.579 |
| 0.047726052414296616 | 0.636 |
| 0.09984875296827389 | 0.562 |
| 0.18779684356037496 | 0.412 |
| 0.18540703182949625 | 0.401 |
| 0.22946911529851755 | 0.424 |
| 0.22600930356614335 | 0.565 |
| 0.35285269587216206 | 0.802 |
| 0.2067746612729734 | 0.561 |
| 0.30123362205992976 | 0.53 |
| 0.12949493211583019 | 0.54 |
| 0.2496469980373286 | 0.704 |
| 0.22974424560696916 | 0.768 |
| 0.28824040191339584 | 0.626 |
| 0.2589160427406979 | 0.479 |
| 0.34017502566537183 | 0.489 |
| 0.6257302561664211 | 0.777 |
| 0.2613245749783042 | 0.612 |
| 0.3695274777521854 | 0.496 |
| 0.14630391773882967 | 0.322 |
| 0.36894945393796497 | 0.583 |
| 0.1769490327786628 | 0.439 |
| 0.40271435559372604 | 0.686 |
| 0.2300948819286438 | 0.494 |
| 0.392270515019696 | 0.79 |
| 0.13298760229770468 | 0.324 |
| 0.15850108650241568 | 0.656 |
| 0.2628609535113975 | 0.604 |
| 0.13930247355186598 | 0.38 |
| 0.3569795483404967 | 0.457 |
| 0.5206463698507672 | 0.716 |
| 0.3226512734321101 | 0.602 |
| 0.22911557685666784 | 0.507 |
| 0.3136555294995854 | 0.501 |
| 0.07629993552018355 | 0.246 |
| 0.3814444807336962 | 0.555 |
| 0.10178564128878143 | 0.416 |
| 0.11882865998641923 | 0.34 |
| 0.2714897362908696 | 0.789 |
| 0.11572095190505294 | 0.465 |
| 0.2658213648209756 | 0.592 |
| 0.40635770148406536 | 0.529 |
| 0.18921442386067822 | 0.378 |
| 0.2611693032021477 | 0.694 |
| 0.13371248846336725 | 0.579 |
| 0.36568358177924654 | 0.588 |
| 0.33277628703602524 | 0.559 |
| 0.2228157076440419 | 0.32 |
| 0.2735076131988097 | 0.507 |
| 0.12163057393150334 | 0.482 |
| 0.18474810502249794 | 0.596 |
| 0.21366178948719283 | 0.679 |
| 0.19742973189760826 | 0.434 |
| 0.3836291937974565 | 0.788 |
| 0.30054731068299045 | 0.503 |
| 0.39406555546420274 | 0.672 |
| 0.3082045995871575 | 0.614 |
| 0.30726792235652245 | 0.343 |
| 0.3049975951751759 | 0.623 |
| 0.264552096510682 | 0.795 |
| 0.09343648964338047 | 0.238 |
| 0.3548540196903103 | 0.771 |
| 0.525489279736928 | 0.625 |
| 0.10077274597705954 | 0.454 |
| 0.197434719405728 | 0.531 |
| 0.1764891538541432 | 0.47 |
| 0.40984541395504615 | 0.796 |
| 0.5186722238471313 | 0.649 |
| 0.45291636020619197 | 0.69 |
| 0.23712539866365312 | 0.409 |
| 0.466390861396354 | 0.727 |
| 0.2921183171733147 | 0.446 |
| 0.2416234007630591 | 0.436 |
| 0.23549585041936405 | 0.785 |
| 0.49618255689485824 | 0.614 |
| 0.3447335801335294 | 0.639 |
| 0.13252253873985342 | 0.563 |
| 0.2833851820083504 | 0.51 |
| 0.41431060587793833 | 0.73 |
| 0.3253624968276615 | 0.606 |
| 0.2599722601465302 | 0.537 |
| 0.3235672730816106 | 0.881 |
| 0.03406514491974599 | 0.549 |
| 0.3274942939575505 | 0.535 |
| 0.5131333600355878 | 0.672 |
| 0.467687195115843 | 0.839 |
| 0.5688104037884295 | 0.719 |
| 0.09130540412524202 | 0.449 |
| 0.3693506802986365 | 0.475 |
| 0.11217135774687659 | 0.248 |
| 0.18459577111345715 | 0.502 |
| 0.21231069252251666 | 0.444 |
| 0.27633653809395553 | 0.38 |
| 0.4403417339938456 | 0.654 |
| 0.2157854384383331 | 0.559 |
| 0.24592564399856376 | 0.655 |
| 0.28020635698369556 | 0.595 |
| 0.20623781481170123 | 0.495 |
| 0.2527072545909319 | 0.412 |
| 0.26886915643700415 | 0.448 |
| 0.24364066465846712 | 0.363 |
| 0.3417812012737832 | 0.563 |
| 0.3152892013373616 | 0.62 |
| 0.3350656737619768 | 0.361 |
| 0.19487889706770045 | 0.481 |
| 0.24811825882087468 | 0.519 |
| 0.11811136768358355 | 0.54 |
| 0.10656715694151442 | 0.682 |
| 0.36478413690444333 | 0.394 |
| 0.4590127247669028 | 0.802 |
| 0.23596843074120866 | 0.486 |
| 0.32214008195099886 | 0.874 |
| 0.08290992825420351 | 0.219 |
| 0.31977964283782667 | 0.7 |
| 0.41621204176539905 | 0.519 |
| 0.1751869158790279 | 0.603 |
| 0.3564468708184295 | 0.608 |
| 0.1594298182461552 | 0.713 |
| 0.19963662890378808 | 0.382 |
| 0.2736521337260859 | 0.414 |
| 0.2598113659368879 | 0.449 |
| 0.43857163636696217 | 0.589 |
| 0.2640901146921498 | 0.354 |
| 0.11067893012257102 | 0.299 |
| 0.19137222110909446 | 0.92 |
| 0.2990692210169591 | 0.422 |
| 0.35765651834239875 | 0.579 |
| 0.3697320437745534 | 0.578 |
| 0.3972618941318571 | 0.739 |
| 0.10205603964630705 | 0.283 |
| 0.3000861142800262 | 0.786 |
| 0.22472106974186212 | 0.757 |
| 0.39136577024990604 | 0.554 |
| 0.2989011807353671 | 0.517 |
| 0.16015711629515328 | 0.557 |
| 0.4541927465428388 | 0.66 |
| 0.10543033289477344 | 0.334 |
| 0.20060398291750703 | 0.705 |
| 0.22028502106400083 | 0.54 |
| 0.18281657141422458 | 0.501 |
| 0.3474698242018819 | 0.578 |
| 0.3047224912870895 | 0.449 |
| 0.2708171983545897 | 0.422 |
| 0.45754080369537176 | 0.747 |
| 0.18246167044620587 | 0.669 |
| 0.29010331837142944 | 0.747 |
| 0.42407389840892806 | 0.711 |
| 0.29165211428143356 | 0.666 |
| 0.279212064141245 | 0.653 |
| 0.33933399307426027 | 0.492 |
| 0.25101272165824784 | 0.61 |
| 0.46462995880716595 | 0.658 |
| 0.1672557365913918 | 0.344 |
| 0.13273765867959886 | 0.399 |
| 0.16832254188683682 | 0.622 |
| 0.43953705798754117 | 0.638 |
| 0.22731301159662398 | 0.683 |
| 0.372531800622698 | 0.568 |
| 0.36720945777938063 | 0.658 |
| 0.39616662802159675 | 0.566 |
| 0.4022851850265746 | 0.523 |
| 0.3495910131398339 | 0.828 |
| 0.17958728762760223 | 0.468 |
| 0.06001717263594497 | 0.186 |
| 0.10846256536092458 | 0.318 |
| 0.199701295754514 | 0.575 |
| 0.13635217815246636 | 0.588 |
| 0.16145021461781295 | 0.556 |
| 0.21288904188045055 | 0.509 |
| 0.09777369554691684 | 0.652 |
| 0.07758355868956224 | 0.518 |
| 0.33441363931152834 | 0.424 |
| 0.45636800238822817 | 0.721 |
| 0.07954544311867195 | 0.189 |
| 0.2952180844829537 | 0.576 |
| 0.10628730726828695 | 0.251 |
| 0.23125462142951103 | 0.422 |
| 0.71027092758319 | 0.811 |
| 0.4505806425061173 | 0.868 |
| 0.2924220251712685 | 0.404 |
| 0.324969097872012 | 0.557 |
| 0.30639590250033666 | 0.548 |
| 0.32825753599022356 | 0.772 |
| 0.24215947724355347 | 0.568 |
| 0.30638926944606093 | 0.776 |
| 0.21905631145071114 | 0.488 |
| 0.2618063428014923 | 0.634 |
| 0.39150886613107083 | 0.531 |
| 0.5258610028249019 | 0.801 |
| 0.27652055846287416 | 0.425 |
| 0.3717924638876685 | 0.548 |
| 0.5405492000381117 | 0.765 |
| 0.18066577233485825 | 0.526 |
| 0.19324378482394622 | 0.539 |
| 0.3192105181113184 | 0.39 |